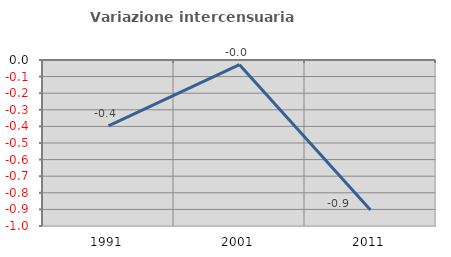
| Category | Variazione intercensuaria annua |
|---|---|
| 1991.0 | -0.396 |
| 2001.0 | -0.028 |
| 2011.0 | -0.904 |